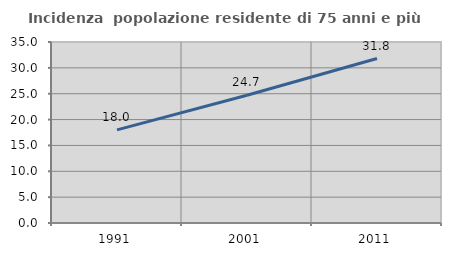
| Category | Incidenza  popolazione residente di 75 anni e più |
|---|---|
| 1991.0 | 18.011 |
| 2001.0 | 24.706 |
| 2011.0 | 31.809 |